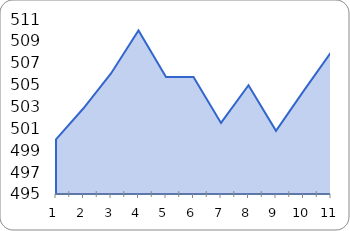
| Category | Series 0 |
|---|---|
| 0 | 500 |
| 1 | 502.84 |
| 2 | 506.02 |
| 3 | 509.96 |
| 4 | 505.69 |
| 5 | 505.69 |
| 6 | 501.5 |
| 7 | 504.94 |
| 8 | 500.77 |
| 9 | 504.41 |
| 10 | 507.95 |